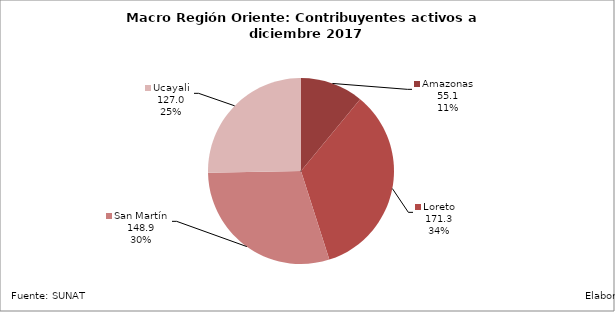
| Category | Contribuyentes |
|---|---|
| Amazonas | 55.085 |
| Loreto | 171.335 |
| San Martín | 148.917 |
| Ucayali | 126.989 |